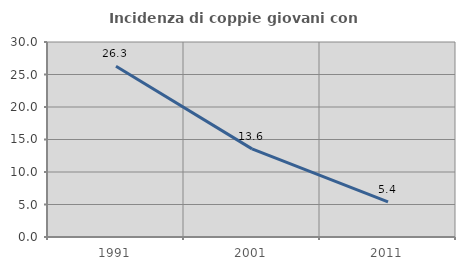
| Category | Incidenza di coppie giovani con figli |
|---|---|
| 1991.0 | 26.276 |
| 2001.0 | 13.562 |
| 2011.0 | 5.39 |